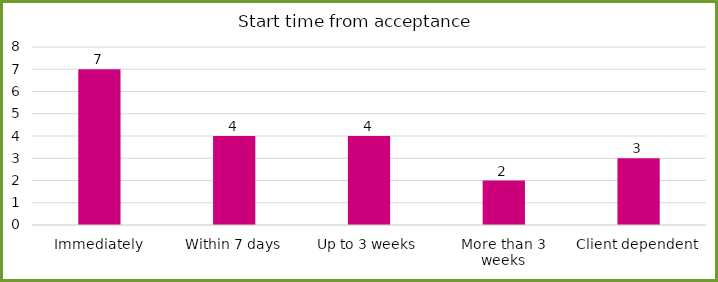
| Category | Series 0 |
|---|---|
| Immediately | 7 |
| Within 7 days | 4 |
| Up to 3 weeks | 4 |
| More than 3 weeks | 2 |
| Client dependent | 3 |